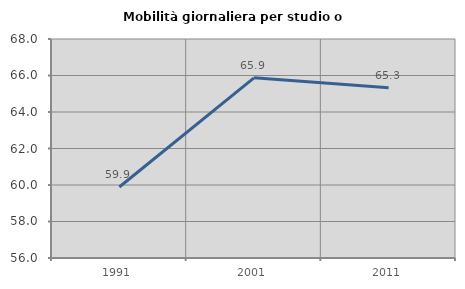
| Category | Mobilità giornaliera per studio o lavoro |
|---|---|
| 1991.0 | 59.892 |
| 2001.0 | 65.872 |
| 2011.0 | 65.33 |